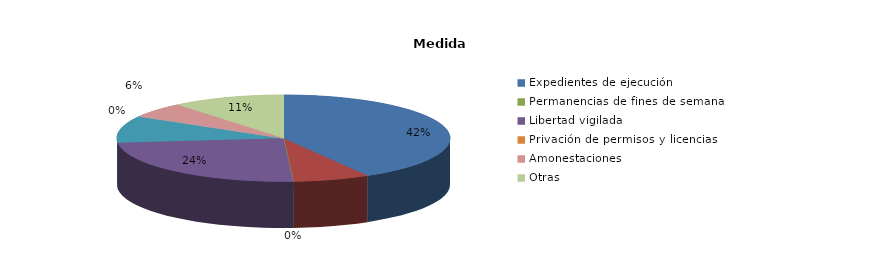
| Category | Series 0 |
|---|---|
| Expedientes de ejecución | 201 |
| Internamientos | 36 |
| Permanencias de fines de semana | 0 |
| Libertad vigilada | 117 |
| Prestaciones en beneficio de la comunidad | 49 |
| Privación de permisos y licencias | 0 |
| Convivencia Familiar Educativa | 0 |
| Amonestaciones | 27 |
| Otras | 53 |